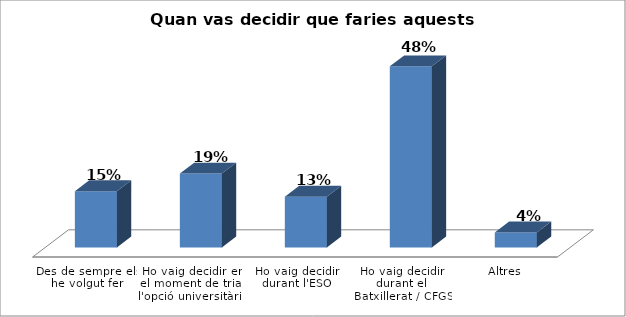
| Category | Series 0 |
|---|---|
| Des de sempre els he volgut fer | 0.148 |
| Ho vaig decidir en el moment de triar l'opció universitària | 0.195 |
| Ho vaig decidir durant l'ESO | 0.134 |
| Ho vaig decidir durant el Batxillerat / CFGS | 0.477 |
| Altres | 0.039 |